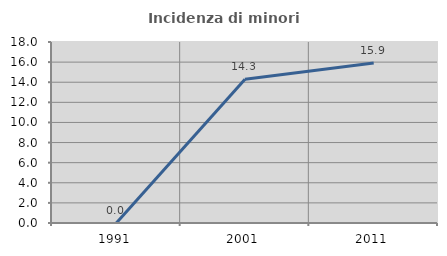
| Category | Incidenza di minori stranieri |
|---|---|
| 1991.0 | 0 |
| 2001.0 | 14.286 |
| 2011.0 | 15.909 |